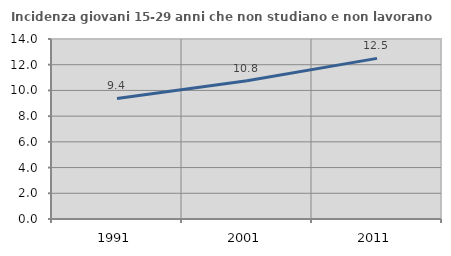
| Category | Incidenza giovani 15-29 anni che non studiano e non lavorano  |
|---|---|
| 1991.0 | 9.375 |
| 2001.0 | 10.758 |
| 2011.0 | 12.492 |